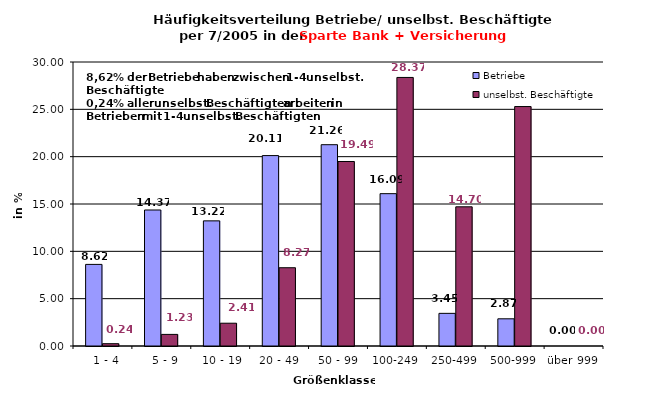
| Category | Betriebe | unselbst. Beschäftigte |
|---|---|---|
|   1 - 4 | 8.621 | 0.244 |
|   5 - 9 | 14.368 | 1.225 |
|  10 - 19 | 13.218 | 2.408 |
| 20 - 49 | 20.115 | 8.269 |
| 50 - 99 | 21.264 | 19.49 |
| 100-249 | 16.092 | 28.368 |
| 250-499 | 3.448 | 14.703 |
| 500-999 | 2.874 | 25.294 |
| über 999 | 0 | 0 |